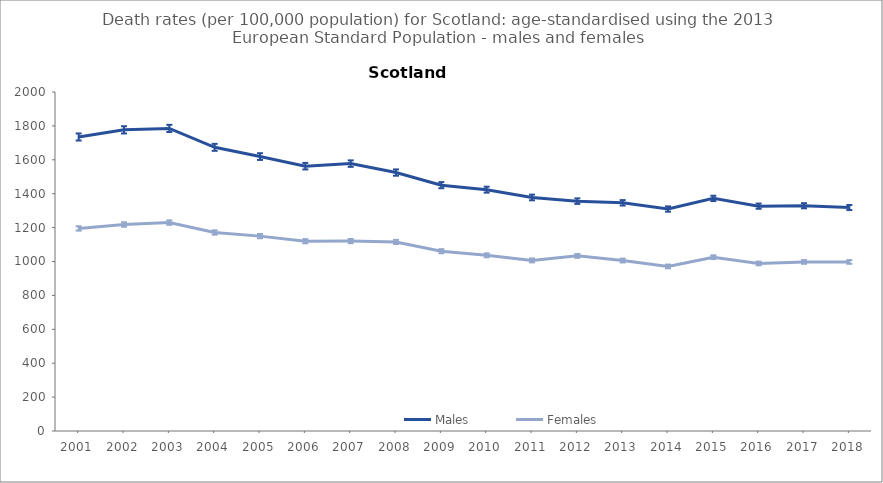
| Category | Males | Females |
|---|---|---|
| 2001.0 | 1734.6 | 1195.1 |
| 2002.0 | 1776.7 | 1218.3 |
| 2003.0 | 1785.1 | 1229.6 |
| 2004.0 | 1673.6 | 1171 |
| 2005.0 | 1619.1 | 1149.7 |
| 2006.0 | 1562.4 | 1119.7 |
| 2007.0 | 1577.5 | 1120.4 |
| 2008.0 | 1524.7 | 1115.4 |
| 2009.0 | 1450.3 | 1060.8 |
| 2010.0 | 1423.8 | 1036.5 |
| 2011.0 | 1377.7 | 1006.5 |
| 2012.0 | 1356.1 | 1033.2 |
| 2013.0 | 1346.2 | 1005.6 |
| 2014.0 | 1309.5 | 970.9 |
| 2015.0 | 1372.3 | 1025.5 |
| 2016.0 | 1326.5 | 988.5 |
| 2017.0 | 1329 | 997.4 |
| 2018.0 | 1318.4 | 997.4 |